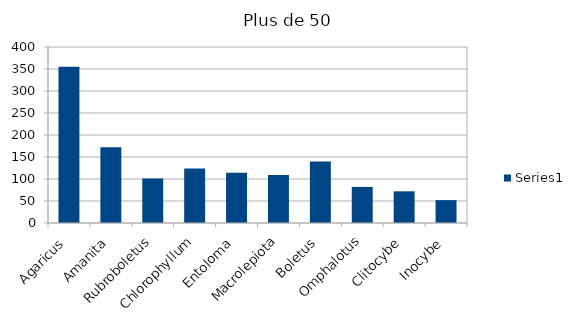
| Category | Series 0 |
|---|---|
| Agaricus  | 355 |
| Amanita | 172 |
| Rubroboletus | 101 |
| Chlorophyllum | 124 |
| Entoloma | 114 |
| Macrolepiota | 109 |
| Boletus | 140 |
| Omphalotus | 82 |
| Clitocybe | 72 |
| Inocybe | 52 |